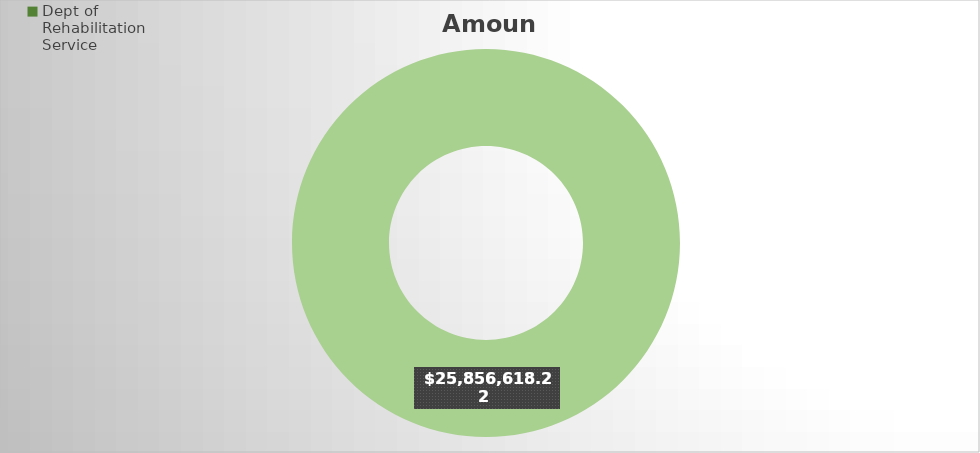
| Category | Amount |
|---|---|
| Dept of Rehabilitation Service | 0 |
| Other | 25856618.22 |